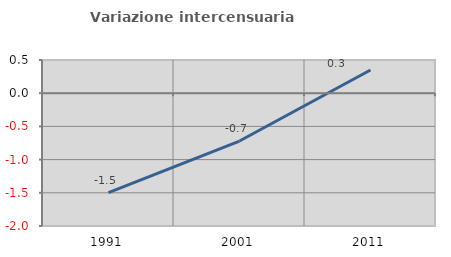
| Category | Variazione intercensuaria annua |
|---|---|
| 1991.0 | -1.497 |
| 2001.0 | -0.721 |
| 2011.0 | 0.349 |